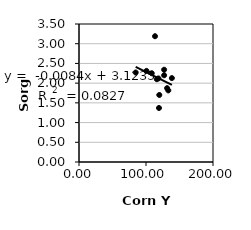
| Category | Series 0 |
|---|---|
| 119.3748675751375 | 1.37 |
| 119.84371061255356 | 1.7 |
| 84.61254935622317 | 2.27 |
| 116.16462652239014 | 2.1 |
| 118.50322619189868 | 2.12 |
| 108.58105654567375 | 2.251 |
| 131.48019479168113 | 1.873 |
| 100.70516997504808 | 2.31 |
| 138.6081880170675 | 2.128 |
| 113.45297330563889 | 3.19 |
| 127.05148536508675 | 2.34 |
| 127.04251220835594 | 2.2 |
| 133.29993630486928 | 1.815 |